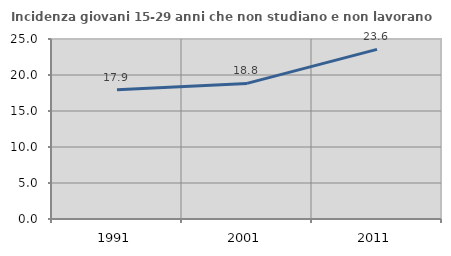
| Category | Incidenza giovani 15-29 anni che non studiano e non lavorano  |
|---|---|
| 1991.0 | 17.942 |
| 2001.0 | 18.834 |
| 2011.0 | 23.558 |